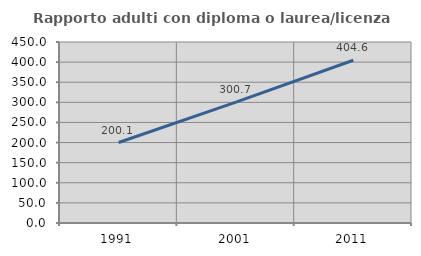
| Category | Rapporto adulti con diploma o laurea/licenza media  |
|---|---|
| 1991.0 | 200.083 |
| 2001.0 | 300.696 |
| 2011.0 | 404.594 |